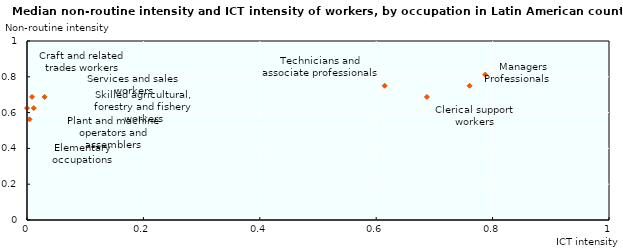
| Category | _pooled |
|---|---|
| 0.7873327732086182 | 0.812 |
| 0.7603869438171387 | 0.75 |
| 0.6145128011703491 | 0.75 |
| 0.6871486306190491 | 0.688 |
| 0.0302929151803255 | 0.688 |
| 0.0 | 0.625 |
| 0.0086283152922988 | 0.688 |
| 0.0116432523354888 | 0.625 |
| 0.0042961812578142 | 0.562 |